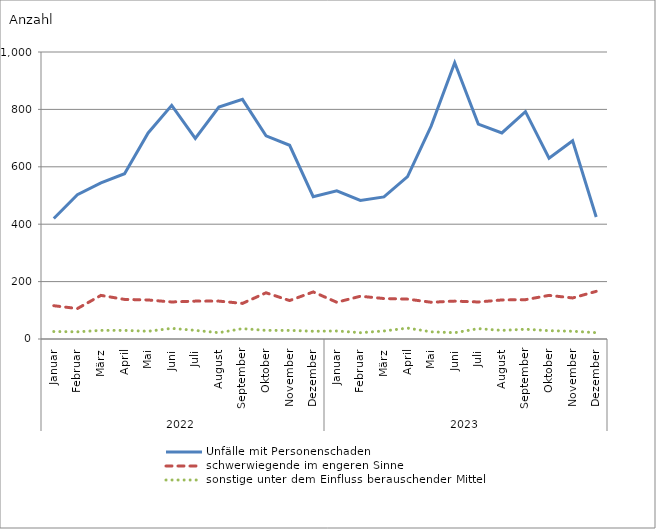
| Category | Unfälle mit Personenschaden | schwerwiegende im engeren Sinne | sonstige unter dem Einfluss berauschender Mittel |
|---|---|---|---|
| 0 | 420 | 116 | 26 |
| 1 | 503 | 106 | 25 |
| 2 | 544 | 152 | 30 |
| 3 | 576 | 138 | 30 |
| 4 | 718 | 136 | 27 |
| 5 | 814 | 129 | 37 |
| 6 | 699 | 132 | 30 |
| 7 | 808 | 132 | 22 |
| 8 | 835 | 124 | 36 |
| 9 | 708 | 161 | 30 |
| 10 | 675 | 134 | 30 |
| 11 | 496 | 164 | 27 |
| 12 | 516 | 128 | 28 |
| 13 | 483 | 149 | 22 |
| 14 | 495 | 141 | 28 |
| 15 | 566 | 139 | 38 |
| 16 | 742 | 128 | 25 |
| 17 | 963 | 132 | 22 |
| 18 | 749 | 129 | 36 |
| 19 | 718 | 136 | 30 |
| 20 | 792 | 137 | 34 |
| 21 | 630 | 152 | 29 |
| 22 | 691 | 143 | 27 |
| 23 | 425 | 166 | 22 |